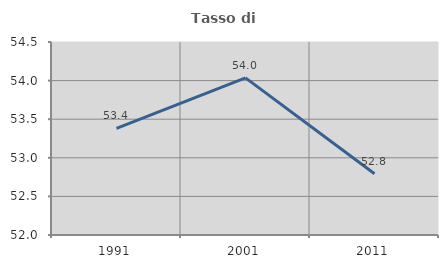
| Category | Tasso di occupazione   |
|---|---|
| 1991.0 | 53.382 |
| 2001.0 | 54.036 |
| 2011.0 | 52.793 |